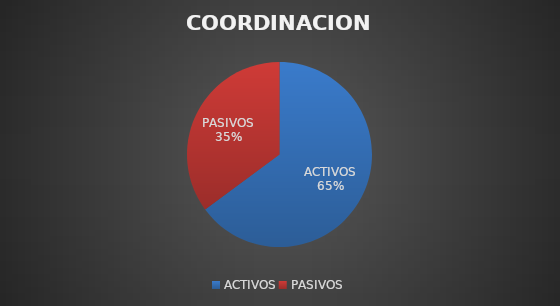
| Category | Series 0 |
|---|---|
| ACTIVOS | 24 |
| PASIVOS | 13 |